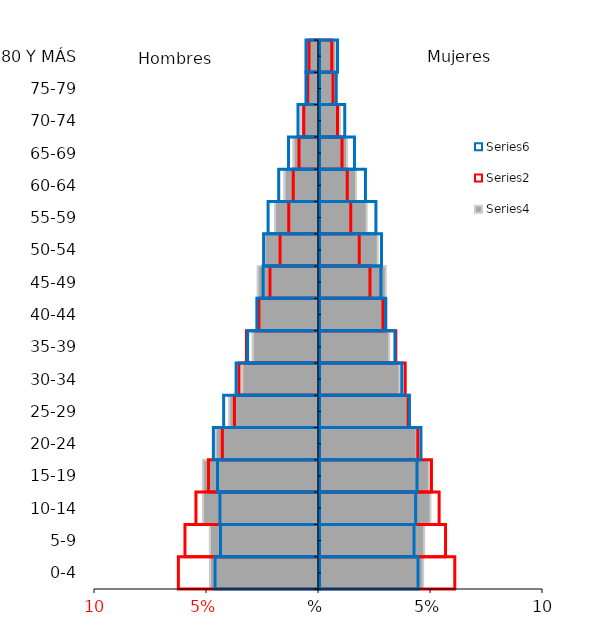
| Category | 2015 | Series 3 | Series 1 | 2005 | 2020 | Series 5 |
|---|---|---|---|---|---|---|
| 0-4 | -0.049 | 0.047 | 0.061 | -0.063 | -0.047 | 0.044 |
| 5-9 | -0.049 | 0.047 | 0.056 | -0.06 | -0.044 | 0.042 |
| 10-14 | -0.052 | 0.05 | 0.054 | -0.055 | -0.044 | 0.043 |
| 15-19 | -0.052 | 0.049 | 0.05 | -0.05 | -0.046 | 0.044 |
| 20-24 | -0.046 | 0.044 | 0.044 | -0.043 | -0.047 | 0.046 |
| 25-29 | -0.04 | 0.04 | 0.04 | -0.038 | -0.043 | 0.04 |
| 30-34 | -0.034 | 0.036 | 0.038 | -0.036 | -0.037 | 0.037 |
| 35-39 | -0.03 | 0.031 | 0.034 | -0.033 | -0.032 | 0.034 |
| 40-44 | -0.028 | 0.03 | 0.029 | -0.027 | -0.028 | 0.03 |
| 45-49 | -0.027 | 0.03 | 0.023 | -0.022 | -0.025 | 0.028 |
| 50-54 | -0.024 | 0.026 | 0.018 | -0.018 | -0.025 | 0.028 |
| 55-59 | -0.02 | 0.021 | 0.014 | -0.014 | -0.023 | 0.025 |
| 60-64 | -0.015 | 0.017 | 0.013 | -0.012 | -0.018 | 0.021 |
| 65-69 | -0.011 | 0.012 | 0.01 | -0.009 | -0.014 | 0.016 |
| 70-74 | -0.008 | 0.009 | 0.008 | -0.007 | -0.01 | 0.011 |
| 75-79 | -0.006 | 0.007 | 0.006 | -0.005 | -0.006 | 0.008 |
| 80 Y MÁS | -0.006 | 0.007 | 0.006 | -0.005 | -0.006 | 0.008 |